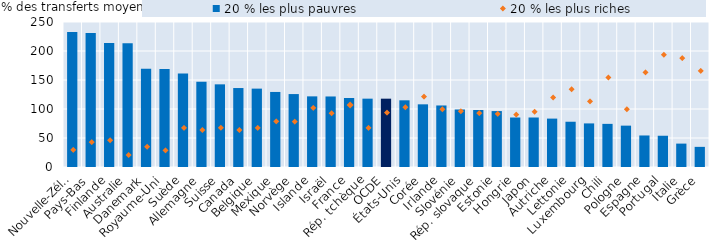
| Category | 20 % les plus pauvres |
|---|---|
| Nouvelle-Zélande | 232.957 |
| Pays-Bas | 230.952 |
| Finlande | 213.87 |
| Australie | 213.175 |
| Danemark | 169.313 |
| Royaume-Uni | 168.771 |
| Suède | 161.372 |
| Allemagne | 147.13 |
| Suisse | 142.509 |
| Canada | 136.15 |
| Belgique | 135.124 |
| Mexique | 129.39 |
| Norvège | 125.742 |
| Islande | 121.78 |
| Israël | 121.6 |
| France | 119 |
| Rép. tchèque | 117.828 |
| OCDE | 117.802 |
| États-Unis | 115.001 |
| Corée | 108.059 |
| Irlande | 106.085 |
| Slovénie | 99.186 |
| Rép. slovaque | 98.262 |
| Estonie | 96.422 |
| Hongrie | 85.352 |
| Japon | 85.338 |
| Autriche | 83.444 |
| Lettonie | 78.043 |
| Luxembourg | 75.154 |
| Chili | 74.371 |
| Pologne | 71.311 |
| Espagne | 54.355 |
| Portugal | 53.889 |
| Italie | 40.34 |
| Grèce | 34.717 |